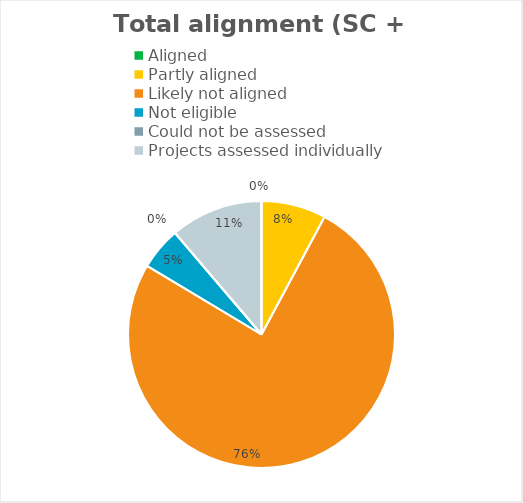
| Category | Series 0 |
|---|---|
| Aligned | 0 |
| Partly aligned | 0.078 |
| Likely not aligned | 0.758 |
| Not eligible  | 0.052 |
| Could not be assessed  | 0 |
| Projects assessed individually  | 0.112 |